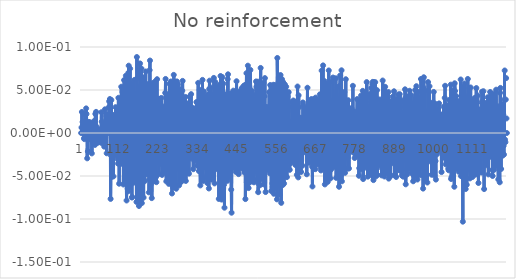
| Category | No reinforcement |
|---|---|
| 0 | 0 |
| 1 | 0.006 |
| 2 | 0.024 |
| 3 | 0.006 |
| 4 | 0.013 |
| 5 | 0.007 |
| 6 | 0 |
| 7 | 0.007 |
| 8 | -0.006 |
| 9 | -0.007 |
| 10 | -0.006 |
| 11 | 0.022 |
| 12 | -0.002 |
| 13 | -0.003 |
| 14 | 0.029 |
| 15 | 0.022 |
| 16 | -0.003 |
| 17 | -0.029 |
| 18 | -0.005 |
| 19 | -0.021 |
| 20 | 0.001 |
| 21 | 0.013 |
| 22 | 0.002 |
| 23 | 0.013 |
| 24 | 0.007 |
| 25 | -0.005 |
| 26 | -0.005 |
| 27 | 0.012 |
| 28 | -0.008 |
| 29 | -0.004 |
| 30 | -0.024 |
| 31 | -0.005 |
| 32 | -0.008 |
| 33 | -0.004 |
| 34 | -0.008 |
| 35 | 0.008 |
| 36 | -0.004 |
| 37 | 0.014 |
| 38 | -0.004 |
| 39 | -0.014 |
| 40 | 0.022 |
| 41 | 0.003 |
| 42 | 0.025 |
| 43 | 0.008 |
| 44 | -0.002 |
| 45 | -0.001 |
| 46 | -0.011 |
| 47 | -0.01 |
| 48 | 0.004 |
| 49 | -0.01 |
| 50 | -0.004 |
| 51 | -0.001 |
| 52 | 0.004 |
| 53 | 0.003 |
| 54 | -0.004 |
| 55 | -0.005 |
| 56 | -0.011 |
| 57 | 0.024 |
| 58 | 0.013 |
| 59 | 0.005 |
| 60 | 0.001 |
| 61 | -0.012 |
| 62 | -0.002 |
| 63 | 0.01 |
| 64 | -0.012 |
| 65 | -0.016 |
| 66 | 0 |
| 67 | 0.028 |
| 68 | 0.01 |
| 69 | 0.002 |
| 70 | 0 |
| 71 | -0.001 |
| 72 | -0.024 |
| 73 | 0.022 |
| 74 | 0.008 |
| 75 | 0.01 |
| 76 | 0.003 |
| 77 | 0.01 |
| 78 | 0.03 |
| 79 | 0.037 |
| 80 | 0.021 |
| 81 | 0.04 |
| 82 | 0.006 |
| 83 | -0.077 |
| 84 | -0.026 |
| 85 | 0.038 |
| 86 | 0.001 |
| 87 | -0.051 |
| 88 | -0.024 |
| 89 | 0.006 |
| 90 | -0.022 |
| 91 | -0.05 |
| 92 | -0.001 |
| 93 | 0.021 |
| 94 | -0.019 |
| 95 | -0.013 |
| 96 | 0.013 |
| 97 | 0.03 |
| 98 | -0.003 |
| 99 | -0.026 |
| 100 | -0.015 |
| 101 | 0.02 |
| 102 | 0.027 |
| 103 | -0.03 |
| 104 | -0.036 |
| 105 | 0.041 |
| 106 | 0.017 |
| 107 | -0.059 |
| 108 | -0.027 |
| 109 | 0.025 |
| 110 | 0.034 |
| 111 | -0.036 |
| 112 | -0.019 |
| 113 | 0.054 |
| 114 | 0.032 |
| 115 | -0.023 |
| 116 | -0.03 |
| 117 | 0.048 |
| 118 | 0.034 |
| 119 | -0.06 |
| 120 | -0.021 |
| 121 | 0.062 |
| 122 | 0.036 |
| 123 | -0.037 |
| 124 | -0.034 |
| 125 | 0.049 |
| 126 | 0.067 |
| 127 | -0.054 |
| 128 | -0.078 |
| 129 | 0.035 |
| 130 | 0.052 |
| 131 | -0.065 |
| 132 | -0.068 |
| 133 | 0.07 |
| 134 | 0.078 |
| 135 | -0.042 |
| 136 | -0.063 |
| 137 | 0.047 |
| 138 | 0.075 |
| 139 | -0.055 |
| 140 | -0.02 |
| 141 | 0.058 |
| 142 | 0.054 |
| 143 | -0.075 |
| 144 | -0.074 |
| 145 | 0.046 |
| 146 | 0.043 |
| 147 | -0.042 |
| 148 | -0.058 |
| 149 | 0.046 |
| 150 | 0.062 |
| 151 | -0.029 |
| 152 | -0.042 |
| 153 | 0.046 |
| 154 | -0.009 |
| 155 | -0.037 |
| 156 | -0.08 |
| 157 | 0.088 |
| 158 | 0.064 |
| 159 | -0.037 |
| 160 | -0.063 |
| 161 | 0.054 |
| 162 | 0.051 |
| 163 | -0.085 |
| 164 | -0.077 |
| 165 | 0.071 |
| 166 | 0.081 |
| 167 | -0.066 |
| 168 | -0.075 |
| 169 | 0.065 |
| 170 | 0.075 |
| 171 | -0.082 |
| 172 | -0.069 |
| 173 | 0.065 |
| 174 | 0.054 |
| 175 | -0.044 |
| 176 | -0.075 |
| 177 | 0.042 |
| 178 | 0.05 |
| 179 | -0.056 |
| 180 | -0.039 |
| 181 | 0.054 |
| 182 | 0.072 |
| 183 | -0.031 |
| 184 | -0.048 |
| 185 | 0.053 |
| 186 | 0.045 |
| 187 | -0.038 |
| 188 | -0.048 |
| 189 | 0.057 |
| 190 | 0.042 |
| 191 | -0.069 |
| 192 | -0.054 |
| 193 | 0.073 |
| 194 | 0.084 |
| 195 | -0.049 |
| 196 | -0.06 |
| 197 | 0.033 |
| 198 | 0.053 |
| 199 | -0.076 |
| 200 | -0.053 |
| 201 | 0.046 |
| 202 | 0.058 |
| 203 | -0.031 |
| 204 | -0.056 |
| 205 | 0.045 |
| 206 | 0.021 |
| 207 | -0.042 |
| 208 | -0.042 |
| 209 | 0.06 |
| 210 | 0.041 |
| 211 | -0.051 |
| 212 | -0.057 |
| 213 | 0.04 |
| 214 | 0.063 |
| 215 | -0.026 |
| 216 | -0.034 |
| 217 | 0.038 |
| 218 | 0.016 |
| 219 | -0.048 |
| 220 | -0.023 |
| 221 | 0.02 |
| 222 | 0.04 |
| 223 | -0.023 |
| 224 | -0.036 |
| 225 | 0.018 |
| 226 | 0.041 |
| 227 | 0.013 |
| 228 | -0.049 |
| 229 | 0.022 |
| 230 | 0.028 |
| 231 | -0.024 |
| 232 | -0.046 |
| 233 | 0.031 |
| 234 | 0.005 |
| 235 | -0.028 |
| 236 | -0.032 |
| 237 | 0.047 |
| 238 | 0.063 |
| 239 | -0.043 |
| 240 | -0.056 |
| 241 | 0.026 |
| 242 | 0.015 |
| 243 | -0.026 |
| 244 | -0.043 |
| 245 | 0.044 |
| 246 | 0.039 |
| 247 | -0.059 |
| 248 | -0.031 |
| 249 | 0.057 |
| 250 | 0.038 |
| 251 | -0.012 |
| 252 | -0.059 |
| 253 | 0.06 |
| 254 | 0.04 |
| 255 | -0.05 |
| 256 | -0.07 |
| 257 | 0.056 |
| 258 | 0.059 |
| 259 | -0.063 |
| 260 | -0.055 |
| 261 | 0.068 |
| 262 | 0.058 |
| 263 | -0.054 |
| 264 | -0.059 |
| 265 | 0.025 |
| 266 | 0.055 |
| 267 | -0.06 |
| 268 | -0.065 |
| 269 | 0.057 |
| 270 | 0.06 |
| 271 | -0.032 |
| 272 | -0.042 |
| 273 | 0.056 |
| 274 | 0.047 |
| 275 | -0.025 |
| 276 | -0.061 |
| 277 | 0.04 |
| 278 | 0.046 |
| 279 | -0.035 |
| 280 | -0.057 |
| 281 | 0.043 |
| 282 | 0.051 |
| 283 | -0.056 |
| 284 | -0.044 |
| 285 | 0.049 |
| 286 | 0.061 |
| 287 | -0.025 |
| 288 | -0.054 |
| 289 | 0.04 |
| 290 | 0.035 |
| 291 | -0.033 |
| 292 | -0.03 |
| 293 | 0.017 |
| 294 | 0.042 |
| 295 | -0.056 |
| 296 | -0.041 |
| 297 | 0.03 |
| 298 | 0.029 |
| 299 | -0.032 |
| 300 | -0.045 |
| 301 | 0.021 |
| 302 | 0.034 |
| 303 | -0.022 |
| 304 | -0.047 |
| 305 | 0.035 |
| 306 | 0.043 |
| 307 | -0.026 |
| 308 | -0.029 |
| 309 | 0.011 |
| 310 | 0.045 |
| 311 | -0.013 |
| 312 | -0.002 |
| 313 | 0.003 |
| 314 | 0.029 |
| 315 | -0.015 |
| 316 | -0.042 |
| 317 | 0.011 |
| 318 | 0.029 |
| 319 | -0.032 |
| 320 | -0.019 |
| 321 | 0.013 |
| 322 | 0.025 |
| 323 | -0.007 |
| 324 | -0.027 |
| 325 | 0.036 |
| 326 | 0.024 |
| 327 | -0.038 |
| 328 | -0.004 |
| 329 | 0.035 |
| 330 | 0.058 |
| 331 | -0.034 |
| 332 | -0.044 |
| 333 | 0.037 |
| 334 | 0.05 |
| 335 | -0.041 |
| 336 | -0.061 |
| 337 | 0.032 |
| 338 | 0.03 |
| 339 | -0.036 |
| 340 | -0.049 |
| 341 | 0.03 |
| 342 | 0.062 |
| 343 | -0.055 |
| 344 | -0.056 |
| 345 | 0.034 |
| 346 | 0.048 |
| 347 | -0.04 |
| 348 | -0.03 |
| 349 | 0.041 |
| 350 | 0.035 |
| 351 | -0.029 |
| 352 | -0.051 |
| 353 | 0.036 |
| 354 | 0.041 |
| 355 | -0.028 |
| 356 | -0.058 |
| 357 | 0.044 |
| 358 | 0.045 |
| 359 | -0.046 |
| 360 | -0.064 |
| 361 | 0.051 |
| 362 | 0.061 |
| 363 | -0.037 |
| 364 | -0.042 |
| 365 | 0.053 |
| 366 | 0.032 |
| 367 | -0.025 |
| 368 | -0.054 |
| 369 | 0.044 |
| 370 | 0.045 |
| 371 | -0.034 |
| 372 | -0.039 |
| 373 | 0.036 |
| 374 | 0.064 |
| 375 | -0.035 |
| 376 | -0.059 |
| 377 | 0.021 |
| 378 | 0.059 |
| 379 | -0.034 |
| 380 | -0.042 |
| 381 | 0.047 |
| 382 | 0.024 |
| 383 | -0.008 |
| 384 | -0.035 |
| 385 | 0.053 |
| 386 | 0.028 |
| 387 | -0.034 |
| 388 | -0.077 |
| 389 | 0.05 |
| 390 | 0.056 |
| 391 | 0.003 |
| 392 | -0.049 |
| 393 | 0.066 |
| 394 | 0.028 |
| 395 | -0.071 |
| 396 | -0.077 |
| 397 | 0.047 |
| 398 | 0.065 |
| 399 | -0.034 |
| 400 | -0.049 |
| 401 | 0.057 |
| 402 | 0.046 |
| 403 | -0.06 |
| 404 | -0.087 |
| 405 | 0.044 |
| 406 | 0.034 |
| 407 | -0.009 |
| 408 | -0.053 |
| 409 | 0.031 |
| 410 | 0.043 |
| 411 | -0.024 |
| 412 | -0.056 |
| 413 | 0.063 |
| 414 | 0.068 |
| 415 | -0.044 |
| 416 | -0.052 |
| 417 | 0.041 |
| 418 | 0.045 |
| 419 | -0.014 |
| 420 | -0.046 |
| 421 | 0.044 |
| 422 | 0.045 |
| 423 | -0.066 |
| 424 | -0.093 |
| 425 | 0.046 |
| 426 | 0.035 |
| 427 | -0.028 |
| 428 | -0.04 |
| 429 | 0.049 |
| 430 | 0.045 |
| 431 | -0.039 |
| 432 | -0.032 |
| 433 | 0.036 |
| 434 | 0.026 |
| 435 | -0.034 |
| 436 | -0.045 |
| 437 | 0.03 |
| 438 | 0.06 |
| 439 | -0.045 |
| 440 | -0.039 |
| 441 | 0.028 |
| 442 | 0.047 |
| 443 | -0.045 |
| 444 | -0.048 |
| 445 | 0.044 |
| 446 | 0.048 |
| 447 | -0.034 |
| 448 | -0.038 |
| 449 | 0.046 |
| 450 | 0.023 |
| 451 | -0.034 |
| 452 | -0.041 |
| 453 | 0.052 |
| 454 | 0.023 |
| 455 | -0.019 |
| 456 | -0.035 |
| 457 | 0.022 |
| 458 | 0.055 |
| 459 | -0.042 |
| 460 | -0.046 |
| 461 | 0.04 |
| 462 | 0.056 |
| 463 | -0.077 |
| 464 | -0.045 |
| 465 | 0.042 |
| 466 | 0.07 |
| 467 | -0.057 |
| 468 | -0.051 |
| 469 | 0.041 |
| 470 | 0.078 |
| 471 | -0.031 |
| 472 | -0.064 |
| 473 | 0.016 |
| 474 | 0.072 |
| 475 | -0.046 |
| 476 | -0.057 |
| 477 | 0.073 |
| 478 | 0.048 |
| 479 | -0.044 |
| 480 | -0.01 |
| 481 | 0.049 |
| 482 | 0.044 |
| 483 | -0.052 |
| 484 | -0.056 |
| 485 | 0.045 |
| 486 | 0.038 |
| 487 | -0.057 |
| 488 | -0.045 |
| 489 | 0.039 |
| 490 | 0.024 |
| 491 | -0.031 |
| 492 | -0.037 |
| 493 | 0.06 |
| 494 | 0.054 |
| 495 | -0.04 |
| 496 | -0.054 |
| 497 | 0.049 |
| 498 | 0.06 |
| 499 | -0.069 |
| 500 | -0.059 |
| 501 | 0.039 |
| 502 | 0.05 |
| 503 | -0.027 |
| 504 | -0.061 |
| 505 | 0.047 |
| 506 | 0.076 |
| 507 | -0.051 |
| 508 | -0.046 |
| 509 | 0.052 |
| 510 | 0.03 |
| 511 | -0.054 |
| 512 | -0.042 |
| 513 | 0.039 |
| 514 | 0.058 |
| 515 | -0.06 |
| 516 | -0.033 |
| 517 | 0.043 |
| 518 | 0.064 |
| 519 | -0.025 |
| 520 | -0.069 |
| 521 | 0.03 |
| 522 | 0.03 |
| 523 | -0.03 |
| 524 | -0.027 |
| 525 | 0.01 |
| 526 | 0.03 |
| 527 | -0.023 |
| 528 | -0.043 |
| 529 | 0.028 |
| 530 | 0.048 |
| 531 | -0.009 |
| 532 | -0.047 |
| 533 | 0.056 |
| 534 | 0.048 |
| 535 | -0.034 |
| 536 | -0.067 |
| 537 | 0.042 |
| 538 | 0.044 |
| 539 | -0.059 |
| 540 | -0.063 |
| 541 | 0.055 |
| 542 | 0.056 |
| 543 | -0.071 |
| 544 | -0.055 |
| 545 | 0.045 |
| 546 | 0.056 |
| 547 | -0.054 |
| 548 | -0.063 |
| 549 | 0.052 |
| 550 | 0.055 |
| 551 | -0.051 |
| 552 | -0.077 |
| 553 | 0.087 |
| 554 | 0.048 |
| 555 | -0.061 |
| 556 | -0.041 |
| 557 | 0.06 |
| 558 | 0.062 |
| 559 | -0.052 |
| 560 | -0.072 |
| 561 | 0.062 |
| 562 | 0.067 |
| 563 | -0.048 |
| 564 | -0.081 |
| 565 | 0.053 |
| 566 | 0.063 |
| 567 | -0.053 |
| 568 | -0.061 |
| 569 | 0.059 |
| 570 | 0.051 |
| 571 | -0.04 |
| 572 | -0.059 |
| 573 | 0.037 |
| 574 | 0.057 |
| 575 | -0.05 |
| 576 | -0.036 |
| 577 | 0.043 |
| 578 | 0.054 |
| 579 | -0.031 |
| 580 | -0.051 |
| 581 | 0.008 |
| 582 | 0.042 |
| 583 | -0.031 |
| 584 | -0.032 |
| 585 | 0.048 |
| 586 | 0.03 |
| 587 | -0.026 |
| 588 | -0.043 |
| 589 | 0.013 |
| 590 | 0.013 |
| 591 | -0.035 |
| 592 | -0.032 |
| 593 | 0.012 |
| 594 | 0.036 |
| 595 | -0.004 |
| 596 | -0.029 |
| 597 | 0.025 |
| 598 | 0.038 |
| 599 | -0.02 |
| 600 | -0.033 |
| 601 | 0.032 |
| 602 | 0.036 |
| 603 | -0.028 |
| 604 | -0.037 |
| 605 | 0.037 |
| 606 | 0.035 |
| 607 | -0.012 |
| 608 | -0.049 |
| 609 | 0.008 |
| 610 | 0.054 |
| 611 | -0.031 |
| 612 | -0.052 |
| 613 | 0.044 |
| 614 | 0.03 |
| 615 | -0.015 |
| 616 | -0.021 |
| 617 | 0.011 |
| 618 | 0.018 |
| 619 | -0.003 |
| 620 | -0.045 |
| 621 | 0.018 |
| 622 | 0.016 |
| 623 | -0.01 |
| 624 | -0.038 |
| 625 | 0.036 |
| 626 | 0.033 |
| 627 | -0.019 |
| 628 | -0.022 |
| 629 | 0.016 |
| 630 | 0.029 |
| 631 | -0.004 |
| 632 | -0.011 |
| 633 | 0.027 |
| 634 | 0.022 |
| 635 | -0.013 |
| 636 | -0.048 |
| 637 | 0.023 |
| 638 | 0.053 |
| 639 | -0.017 |
| 640 | -0.034 |
| 641 | 0.009 |
| 642 | 0.035 |
| 643 | -0.035 |
| 644 | -0.019 |
| 645 | -0.005 |
| 646 | 0.027 |
| 647 | -0.021 |
| 648 | -0.016 |
| 649 | 0.039 |
| 650 | 0.021 |
| 651 | -0.039 |
| 652 | -0.062 |
| 653 | 0.031 |
| 654 | 0.036 |
| 655 | -0.031 |
| 656 | -0.042 |
| 657 | 0.04 |
| 658 | 0.022 |
| 659 | -0.03 |
| 660 | -0.042 |
| 661 | 0.041 |
| 662 | 0.039 |
| 663 | -0.036 |
| 664 | -0.028 |
| 665 | 0.035 |
| 666 | 0.026 |
| 667 | -0.031 |
| 668 | -0.036 |
| 669 | 0.037 |
| 670 | 0.03 |
| 671 | -0.035 |
| 672 | -0.036 |
| 673 | 0.045 |
| 674 | 0.036 |
| 675 | -0.04 |
| 676 | -0.044 |
| 677 | 0.02 |
| 678 | 0.073 |
| 679 | -0.031 |
| 680 | -0.036 |
| 681 | 0.03 |
| 682 | 0.079 |
| 683 | -0.038 |
| 684 | -0.041 |
| 685 | 0.04 |
| 686 | 0.06 |
| 687 | -0.06 |
| 688 | -0.033 |
| 689 | 0.037 |
| 690 | 0.046 |
| 691 | -0.052 |
| 692 | -0.048 |
| 693 | 0.001 |
| 694 | 0.057 |
| 695 | -0.057 |
| 696 | -0.054 |
| 697 | 0.031 |
| 698 | 0.073 |
| 699 | -0.035 |
| 700 | -0.014 |
| 701 | 0.001 |
| 702 | 0.06 |
| 703 | -0.053 |
| 704 | -0.043 |
| 705 | 0.024 |
| 706 | 0.038 |
| 707 | -0.039 |
| 708 | -0.04 |
| 709 | 0.02 |
| 710 | 0.064 |
| 711 | -0.035 |
| 712 | -0.039 |
| 713 | 0.02 |
| 714 | 0.043 |
| 715 | -0.039 |
| 716 | -0.039 |
| 717 | 0.023 |
| 718 | 0.064 |
| 719 | -0.052 |
| 720 | -0.019 |
| 721 | 0.034 |
| 722 | 0.053 |
| 723 | -0.029 |
| 724 | -0.047 |
| 725 | 0.039 |
| 726 | 0.04 |
| 727 | -0.063 |
| 728 | -0.051 |
| 729 | 0.055 |
| 730 | 0.067 |
| 731 | -0.05 |
| 732 | -0.049 |
| 733 | 0.016 |
| 734 | 0.073 |
| 735 | -0.056 |
| 736 | -0.031 |
| 737 | 0.024 |
| 738 | 0.037 |
| 739 | -0.03 |
| 740 | -0.04 |
| 741 | 0.01 |
| 742 | 0.048 |
| 743 | -0.027 |
| 744 | -0.046 |
| 745 | 0.038 |
| 746 | 0.062 |
| 747 | -0.02 |
| 748 | -0.028 |
| 749 | 0.026 |
| 750 | 0.018 |
| 751 | -0.018 |
| 752 | -0.041 |
| 753 | 0.038 |
| 754 | 0.02 |
| 755 | -0.041 |
| 756 | -0.016 |
| 757 | 0.013 |
| 758 | 0.006 |
| 759 | -0.019 |
| 760 | -0.009 |
| 761 | 0.004 |
| 762 | 0.029 |
| 763 | -0.021 |
| 764 | -0.007 |
| 765 | 0.002 |
| 766 | 0.055 |
| 767 | -0.016 |
| 768 | -0.023 |
| 769 | -0.004 |
| 770 | 0.025 |
| 771 | -0.029 |
| 772 | -0.023 |
| 773 | 0.018 |
| 774 | 0.009 |
| 775 | -0.027 |
| 776 | -0.021 |
| 777 | 0.019 |
| 778 | 0.039 |
| 779 | -0.022 |
| 780 | -0.02 |
| 781 | 0.024 |
| 782 | 0.038 |
| 783 | -0.05 |
| 784 | -0.041 |
| 785 | 0.032 |
| 786 | 0.029 |
| 787 | -0.039 |
| 788 | -0.029 |
| 789 | 0.043 |
| 790 | 0.033 |
| 791 | -0.042 |
| 792 | -0.029 |
| 793 | 0.025 |
| 794 | 0.049 |
| 795 | -0.054 |
| 796 | -0.04 |
| 797 | 0.003 |
| 798 | 0.046 |
| 799 | -0.027 |
| 800 | -0.029 |
| 801 | 0.046 |
| 802 | 0.042 |
| 803 | -0.025 |
| 804 | -0.038 |
| 805 | 0.059 |
| 806 | 0.042 |
| 807 | -0.041 |
| 808 | -0.051 |
| 809 | 0.03 |
| 810 | 0.031 |
| 811 | -0.048 |
| 812 | -0.046 |
| 813 | 0.032 |
| 814 | 0.045 |
| 815 | -0.019 |
| 816 | -0.044 |
| 817 | 0.036 |
| 818 | 0.052 |
| 819 | -0.048 |
| 820 | -0.039 |
| 821 | 0.057 |
| 822 | 0.059 |
| 823 | -0.051 |
| 824 | -0.055 |
| 825 | 0.059 |
| 826 | 0.035 |
| 827 | -0.049 |
| 828 | -0.038 |
| 829 | 0.059 |
| 830 | 0.042 |
| 831 | -0.05 |
| 832 | -0.021 |
| 833 | 0.009 |
| 834 | 0.05 |
| 835 | -0.049 |
| 836 | -0.034 |
| 837 | 0.021 |
| 838 | 0.033 |
| 839 | -0.033 |
| 840 | -0.037 |
| 841 | 0.032 |
| 842 | 0.039 |
| 843 | -0.024 |
| 844 | -0.031 |
| 845 | 0.029 |
| 846 | 0.034 |
| 847 | -0.049 |
| 848 | -0.041 |
| 849 | 0.026 |
| 850 | 0.061 |
| 851 | -0.043 |
| 852 | -0.046 |
| 853 | 0.022 |
| 854 | 0.04 |
| 855 | -0.051 |
| 856 | -0.025 |
| 857 | 0.054 |
| 858 | 0.047 |
| 859 | -0.033 |
| 860 | -0.047 |
| 861 | 0.009 |
| 862 | 0.041 |
| 863 | -0.029 |
| 864 | -0.032 |
| 865 | 0.036 |
| 866 | 0.048 |
| 867 | -0.053 |
| 868 | -0.009 |
| 869 | 0.037 |
| 870 | 0.036 |
| 871 | -0.02 |
| 872 | -0.05 |
| 873 | 0.027 |
| 874 | 0.036 |
| 875 | -0.035 |
| 876 | 0.008 |
| 877 | 0.008 |
| 878 | 0.042 |
| 879 | -0.019 |
| 880 | -0.026 |
| 881 | 0.019 |
| 882 | 0.048 |
| 883 | -0.049 |
| 884 | -0.02 |
| 885 | 0.023 |
| 886 | 0.015 |
| 887 | -0.012 |
| 888 | -0.051 |
| 889 | 0.039 |
| 890 | 0.029 |
| 891 | -0.037 |
| 892 | -0.04 |
| 893 | 0.035 |
| 894 | 0.045 |
| 895 | -0.032 |
| 896 | -0.043 |
| 897 | 0.042 |
| 898 | 0.045 |
| 899 | -0.02 |
| 900 | -0.044 |
| 901 | 0.03 |
| 902 | 0.038 |
| 903 | -0.03 |
| 904 | -0.049 |
| 905 | 0.022 |
| 906 | 0.024 |
| 907 | -0.027 |
| 908 | -0.051 |
| 909 | 0.021 |
| 910 | 0.036 |
| 911 | -0.005 |
| 912 | -0.032 |
| 913 | 0.051 |
| 914 | 0.04 |
| 915 | -0.06 |
| 916 | -0.042 |
| 917 | 0.024 |
| 918 | 0.043 |
| 919 | -0.048 |
| 920 | -0.035 |
| 921 | 0.02 |
| 922 | 0.023 |
| 923 | -0.013 |
| 924 | -0.041 |
| 925 | 0.022 |
| 926 | 0.049 |
| 927 | -0.02 |
| 928 | -0.029 |
| 929 | 0.033 |
| 930 | 0.044 |
| 931 | -0.046 |
| 932 | -0.012 |
| 933 | 0.021 |
| 934 | 0.034 |
| 935 | -0.048 |
| 936 | -0.056 |
| 937 | 0.024 |
| 938 | 0.036 |
| 939 | -0.018 |
| 940 | -0.051 |
| 941 | 0.04 |
| 942 | 0.05 |
| 943 | -0.042 |
| 944 | -0.03 |
| 945 | 0.054 |
| 946 | 0.03 |
| 947 | -0.021 |
| 948 | -0.054 |
| 949 | 0.048 |
| 950 | 0.041 |
| 951 | -0.005 |
| 952 | -0.031 |
| 953 | 0.038 |
| 954 | 0.034 |
| 955 | -0.034 |
| 956 | -0.049 |
| 957 | 0.024 |
| 958 | 0.063 |
| 959 | -0.032 |
| 960 | -0.039 |
| 961 | 0.031 |
| 962 | 0.022 |
| 963 | -0.024 |
| 964 | -0.065 |
| 965 | 0.053 |
| 966 | 0.065 |
| 967 | -0.05 |
| 968 | -0.039 |
| 969 | 0.011 |
| 970 | 0.049 |
| 971 | -0.033 |
| 972 | -0.056 |
| 973 | 0.026 |
| 974 | 0.023 |
| 975 | -0.048 |
| 976 | -0.058 |
| 977 | 0.009 |
| 978 | 0.059 |
| 979 | -0.024 |
| 980 | -0.033 |
| 981 | 0.015 |
| 982 | 0.054 |
| 983 | -0.015 |
| 984 | -0.029 |
| 985 | 0.032 |
| 986 | 0.035 |
| 987 | -0.014 |
| 988 | -0.049 |
| 989 | 0.012 |
| 990 | 0.024 |
| 991 | -0.001 |
| 992 | -0.014 |
| 993 | 0.014 |
| 994 | 0.048 |
| 995 | -0.031 |
| 996 | -0.049 |
| 997 | 0.034 |
| 998 | 0.032 |
| 999 | -0.033 |
| 1000 | -0.054 |
| 1001 | 0.026 |
| 1002 | 0.026 |
| 1003 | -0.025 |
| 1004 | -0.018 |
| 1005 | 0.007 |
| 1006 | 0.028 |
| 1007 | -0.012 |
| 1008 | 0.015 |
| 1009 | 0.034 |
| 1010 | 0.02 |
| 1011 | -0.009 |
| 1012 | -0.021 |
| 1013 | 0.02 |
| 1014 | 0.021 |
| 1015 | -0.016 |
| 1016 | -0.045 |
| 1017 | -0.009 |
| 1018 | 0.022 |
| 1019 | -0.016 |
| 1020 | -0.02 |
| 1021 | 0.021 |
| 1022 | 0.03 |
| 1023 | -0.01 |
| 1024 | -0.029 |
| 1025 | 0.041 |
| 1026 | 0.055 |
| 1027 | -0.014 |
| 1028 | -0.036 |
| 1029 | 0.021 |
| 1030 | 0.032 |
| 1031 | -0.034 |
| 1032 | -0.028 |
| 1033 | 0.025 |
| 1034 | 0.022 |
| 1035 | -0.041 |
| 1036 | -0.043 |
| 1037 | 0.02 |
| 1038 | 0.038 |
| 1039 | -0.012 |
| 1040 | -0.038 |
| 1041 | 0.029 |
| 1042 | 0.056 |
| 1043 | -0.053 |
| 1044 | -0.052 |
| 1045 | 0.039 |
| 1046 | 0.021 |
| 1047 | -0.029 |
| 1048 | -0.024 |
| 1049 | 0.048 |
| 1050 | 0.05 |
| 1051 | -0.028 |
| 1052 | -0.062 |
| 1053 | 0.058 |
| 1054 | 0.049 |
| 1055 | -0.041 |
| 1056 | -0.041 |
| 1057 | 0.043 |
| 1058 | 0.029 |
| 1059 | -0.03 |
| 1060 | -0.025 |
| 1061 | 0.037 |
| 1062 | 0.021 |
| 1063 | -0.03 |
| 1064 | -0.045 |
| 1065 | 0.028 |
| 1066 | 0.037 |
| 1067 | -0.026 |
| 1068 | -0.029 |
| 1069 | 0.012 |
| 1070 | 0.062 |
| 1071 | -0.05 |
| 1072 | -0.022 |
| 1073 | 0.036 |
| 1074 | 0.05 |
| 1075 | -0.048 |
| 1076 | -0.103 |
| 1077 | 0.054 |
| 1078 | 0.039 |
| 1079 | -0.018 |
| 1080 | -0.028 |
| 1081 | 0.058 |
| 1082 | 0.043 |
| 1083 | -0.037 |
| 1084 | -0.065 |
| 1085 | 0.028 |
| 1086 | 0.04 |
| 1087 | -0.06 |
| 1088 | -0.03 |
| 1089 | 0.009 |
| 1090 | 0.063 |
| 1091 | -0.006 |
| 1092 | -0.043 |
| 1093 | 0.033 |
| 1094 | 0.052 |
| 1095 | -0.039 |
| 1096 | -0.053 |
| 1097 | 0.03 |
| 1098 | 0.053 |
| 1099 | -0.012 |
| 1100 | -0.019 |
| 1101 | 0.017 |
| 1102 | 0.013 |
| 1103 | -0.051 |
| 1104 | -0.042 |
| 1105 | 0.035 |
| 1106 | 0.039 |
| 1107 | -0.021 |
| 1108 | -0.015 |
| 1109 | 0.002 |
| 1110 | 0.041 |
| 1111 | -0.048 |
| 1112 | -0.047 |
| 1113 | 0.041 |
| 1114 | 0.052 |
| 1115 | -0.016 |
| 1116 | -0.013 |
| 1117 | 0.011 |
| 1118 | 0.044 |
| 1119 | -0.016 |
| 1120 | -0.058 |
| 1121 | 0.017 |
| 1122 | 0.027 |
| 1123 | -0.006 |
| 1124 | -0.038 |
| 1125 | 0.008 |
| 1126 | -0.001 |
| 1127 | -0.009 |
| 1128 | -0.046 |
| 1129 | 0.036 |
| 1130 | 0.048 |
| 1131 | -0.023 |
| 1132 | -0.022 |
| 1133 | 0.02 |
| 1134 | 0.049 |
| 1135 | -0.022 |
| 1136 | -0.065 |
| 1137 | 0.035 |
| 1138 | 0.01 |
| 1139 | -0.013 |
| 1140 | -0.038 |
| 1141 | 0.032 |
| 1142 | 0.03 |
| 1143 | -0.026 |
| 1144 | -0.035 |
| 1145 | 0.036 |
| 1146 | 0.042 |
| 1147 | -0.026 |
| 1148 | -0.048 |
| 1149 | 0.028 |
| 1150 | 0.022 |
| 1151 | -0.019 |
| 1152 | -0.028 |
| 1153 | 0.048 |
| 1154 | 0.042 |
| 1155 | -0.009 |
| 1156 | -0.015 |
| 1157 | 0.023 |
| 1158 | 0.018 |
| 1159 | -0.043 |
| 1160 | -0.05 |
| 1161 | 0.018 |
| 1162 | 0.046 |
| 1163 | -0.022 |
| 1164 | -0.043 |
| 1165 | 0.039 |
| 1166 | 0.014 |
| 1167 | -0.025 |
| 1168 | -0.039 |
| 1169 | 0.027 |
| 1170 | 0.05 |
| 1171 | -0.021 |
| 1172 | -0.001 |
| 1173 | 0.031 |
| 1174 | 0.005 |
| 1175 | -0.033 |
| 1176 | -0.054 |
| 1177 | 0.031 |
| 1178 | 0.01 |
| 1179 | -0.006 |
| 1180 | -0.057 |
| 1181 | 0.047 |
| 1182 | 0.052 |
| 1183 | -0.021 |
| 1184 | -0.042 |
| 1185 | 0.022 |
| 1186 | 0.034 |
| 1187 | -0.026 |
| 1188 | -0.026 |
| 1189 | 0.015 |
| 1190 | 0.021 |
| 1191 | -0.015 |
| 1192 | -0.025 |
| 1193 | 0.039 |
| 1194 | 0.073 |
| 1195 | -0.008 |
| 1196 | -0.011 |
| 1197 | 0.039 |
| 1198 | 0.064 |
| 1199 | 0.017 |
| 1200 | 0 |